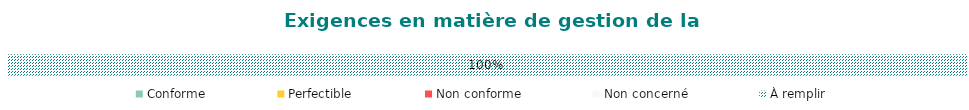
| Category | Conforme | Perfectible | Non conforme | Non concerné | À remplir |
|---|---|---|---|---|---|
| Qualité | 0 | 0 | 0 | 0 | 1 |